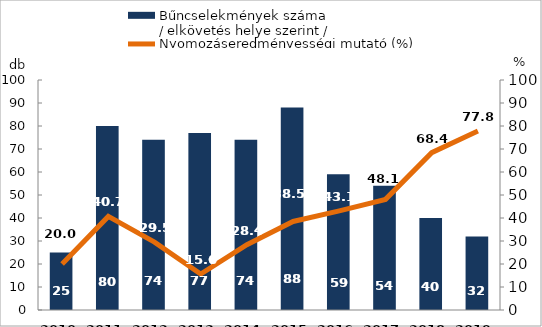
| Category | Bűncselekmények száma
/ elkövetés helye szerint / |
|---|---|
| 2010. év | 25 |
| 2011. év | 80 |
| 2012. év | 74 |
| 2013. év | 77 |
| 2014. év | 74 |
| 2015. év | 88 |
| 2016. év | 59 |
| 2017. év | 54 |
| 2018. év | 40 |
| 2019. év | 32 |